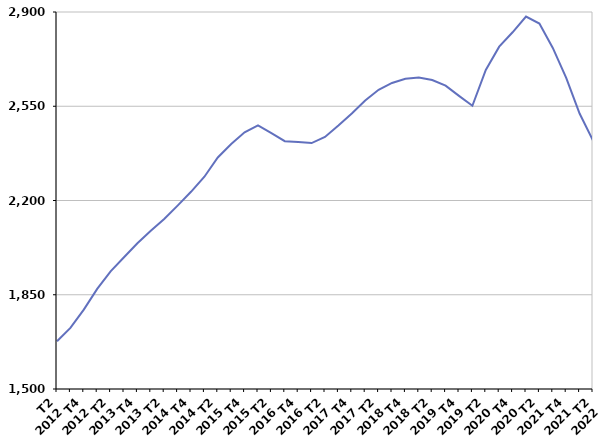
| Category | Inscrits depuis plus d'un an |
|---|---|
| T2
2012 | 1677.5 |
| T3
2012 | 1726.8 |
| T4
2012 | 1794.9 |
| T1
2013 | 1871.8 |
| T2
2013 | 1937.1 |
| T3
2013 | 1989.1 |
| T4
2013 | 2041.1 |
| T1
2014 | 2087.5 |
| T2
2014 | 2131.2 |
| T3
2014 | 2181 |
| T4
2014 | 2232.3 |
| T1
2015 | 2288.3 |
| T2
2015 | 2359.7 |
| T3
2015 | 2409.8 |
| T4
2015 | 2453.2 |
| T1
2016 | 2479.2 |
| T2
2016 | 2450 |
| T3
2016 | 2420.4 |
| T4
2016 | 2417.3 |
| T1
2017 | 2413.2 |
| T2
2017 | 2435.8 |
| T3
2017 | 2478.4 |
| T4
2017 | 2523.2 |
| T1
2018 | 2571.4 |
| T2
2018 | 2611 |
| T3
2018 | 2636.4 |
| T4
2018 | 2652.4 |
| T1
2019 | 2657.1 |
| T2
2019 | 2647.3 |
| T3
2019 | 2626.6 |
| T4
2019 | 2588.6 |
| T1
2020 | 2551.9 |
| T2
2020 | 2685 |
| T3
2020 | 2771.2 |
| T4
2020 | 2824.7 |
| T1
2021 | 2883 |
| T2
2021 | 2857.1 |
| T3
2021 | 2766.6 |
| T4
2021 | 2655.4 |
| T1
2022 | 2522.9 |
| T2
2022 | 2423.2 |